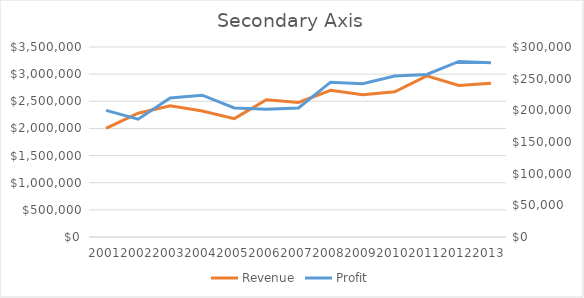
| Category | Revenue |
|---|---|
| 2001.0 | 2000000 |
| 2002.0 | 2280000 |
| 2003.0 | 2416800 |
| 2004.0 | 2320128 |
| 2005.0 | 2180920.32 |
| 2006.0 | 2529867.571 |
| 2007.0 | 2479270.22 |
| 2008.0 | 2702404.54 |
| 2009.0 | 2621332.403 |
| 2010.0 | 2673759.051 |
| 2011.0 | 2967872.547 |
| 2012.0 | 2789800.194 |
| 2013.0 | 2830000 |